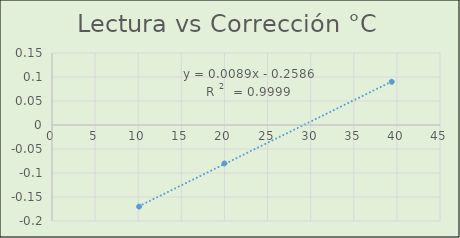
| Category | Series 0 |
|---|---|
| 10.1 | -0.17 |
| 20.0 | -0.08 |
| 39.4 | 0.09 |